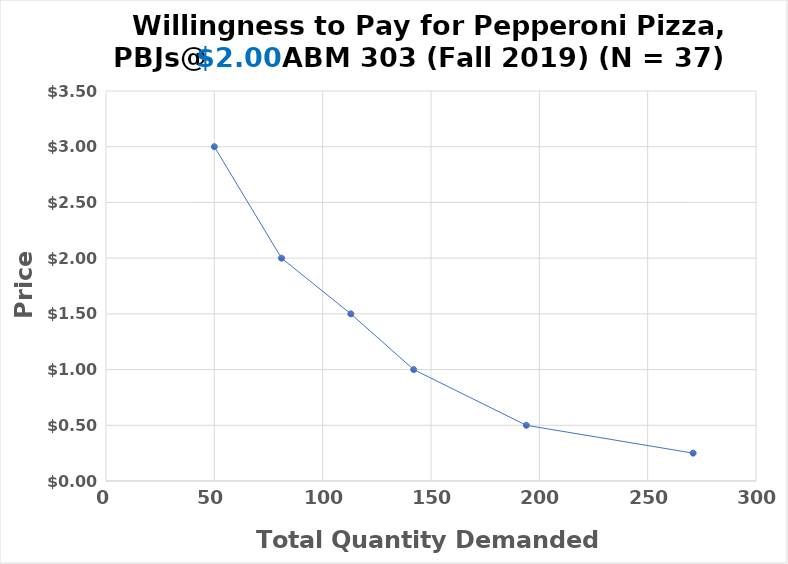
| Category | Price |
|---|---|
| 50.0 | 3 |
| 81.0 | 2 |
| 113.0 | 1.5 |
| 142.0 | 1 |
| 194.0 | 0.5 |
| 271.0 | 0.25 |